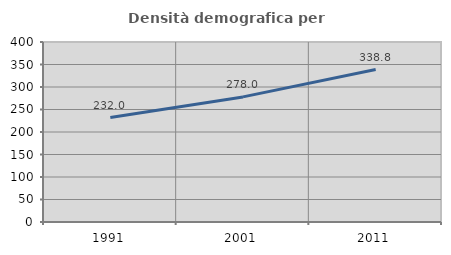
| Category | Densità demografica |
|---|---|
| 1991.0 | 232.004 |
| 2001.0 | 277.998 |
| 2011.0 | 338.849 |